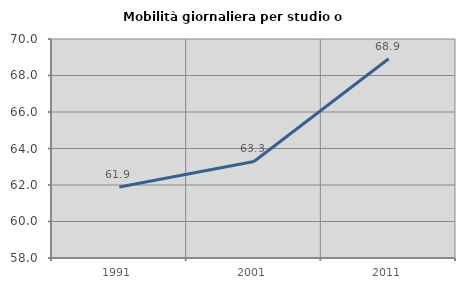
| Category | Mobilità giornaliera per studio o lavoro |
|---|---|
| 1991.0 | 61.892 |
| 2001.0 | 63.29 |
| 2011.0 | 68.918 |